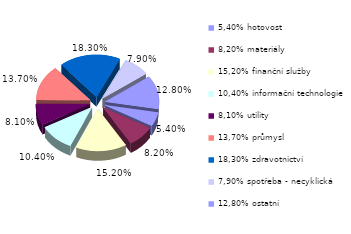
| Category | Series 0 |
|---|---|
| 5,40% hotovost | 0.054 |
| 8,20% materiály | 0.082 |
| 15,20% finanční služby | 0.152 |
| 10,40% informační technologie | 0.104 |
| 8,10% utility | 0.081 |
| 13,70% průmysl | 0.137 |
| 18,30% zdravotnictví | 0.183 |
| 7,90% spotřeba - necyklická | 0.079 |
| 12,80% ostatní | 0.128 |